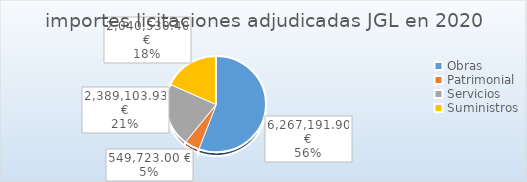
| Category | Series 0 |
|---|---|
| Obras | 6267191.9 |
| Patrimonial | 549723 |
| Servicios | 2389103.93 |
| Suministros | 2040530.4 |